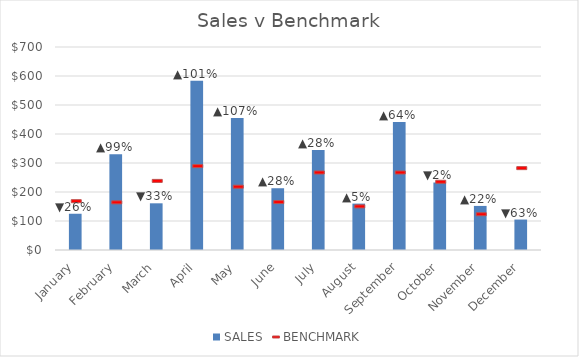
| Category | SALES |
|---|---|
| January | 125 |
| February | 330 |
| March | 161 |
| April | 584 |
| May | 455 |
| June | 213 |
| July | 345 |
| August | 160 |
| September | 441 |
| October | 233 |
| November | 152 |
| December | 105 |